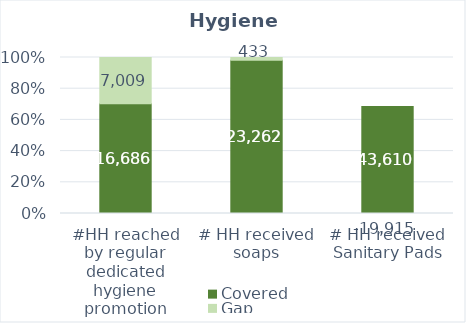
| Category | Covered | Gap |
|---|---|---|
| #HH reached by regular dedicated hygiene promotion | 16685.8 | 7009.2 |
| # HH received soaps | 23262 | 433 |
| # HH received Sanitary Pads | 43610 | -19915 |